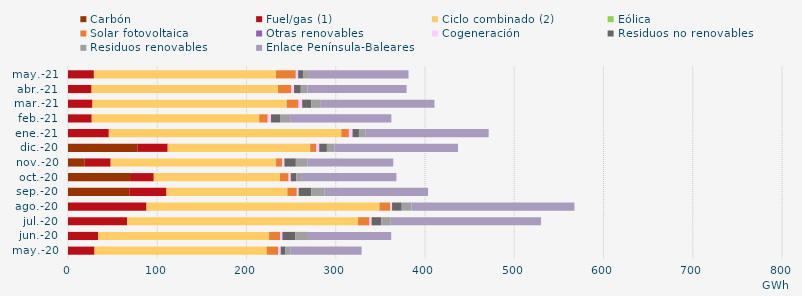
| Category | Carbón | Fuel/gas (1) | Ciclo combinado (2) | Eólica | Solar fotovoltaica | Otras renovables | Cogeneración | Residuos no renovables | Residuos renovables | Enlace Península-Baleares |
|---|---|---|---|---|---|---|---|---|---|---|
| may.-20 | -1.802 | 29.693 | 192.661 | 0.353 | 12.909 | 0.002 | 2.681 | 5.366 | 5.366 | 79.947 |
| jun.-20 | -1.281 | 33.873 | 191.226 | 0.22 | 12.234 | 0.06 | 2.597 | 14.316 | 14.316 | 93.29 |
| jul.-20 | -1.12 | 66.276 | 258.526 | 0.221 | 12.749 | 0.053 | 2.332 | 10.772 | 10.772 | 168.332 |
| ago.-20 | -1.127 | 87.96 | 260.888 | 0.209 | 12.079 | 0.05 | 1.922 | 10.811 | 10.811 | 182.716 |
| sep.-20 | 68.615 | 41.727 | 135.309 | 0.19 | 10.538 | 0.003 | 2.048 | 14.376 | 14.376 | 116.275 |
| oct.-20 | 69.532 | 26.56 | 141.136 | 0.328 | 9.628 | 0.027 | 2.333 | 6.239 | 6.239 | 105.944 |
| nov.-20 | 18.69 | 29.083 | 185.015 | 0.349 | 6.752 | 0.069 | 2.521 | 12.813 | 12.813 | 96.328 |
| dic.-20 | 78.075 | 33.65 | 159.354 | 0.286 | 6.709 | 0.04 | 3.369 | 8.605 | 8.605 | 138.262 |
| ene.-21 | -0.633 | 45.739 | 260.272 | 0.278 | 8.399 | 0.058 | 4.066 | 7.152 | 7.152 | 138.25 |
| feb.-21 | -0.606 | 26.606 | 187.465 | 0.159 | 9.506 | 0.077 | 3.642 | 10.724 | 10.724 | 113.412 |
| mar.-21 | -0.652 | 27.37 | 217.479 | 0.306 | 13.089 | 0.138 | 3.995 | 10.093 | 10.093 | 127.986 |
| abr.-21 | -0.591 | 26.435 | 208.531 | 0.295 | 14.704 | 0.106 | 3.221 | 7.539 | 7.539 | 111.022 |
| may.-21 | -1.103 | 28.997 | 203.813 | 0.19 | 22.187 | 0.119 | 2.572 | 6.024 | 6.024 | 111.602 |